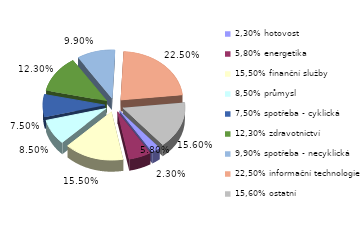
| Category | Series 0 |
|---|---|
| 2,30% hotovost | 0.023 |
| 5,80% energetika | 0.058 |
| 15,50% finanční služby | 0.155 |
| 8,50% průmysl | 0.085 |
| 7,50% spotřeba - cyklická | 0.075 |
| 12,30% zdravotnictví | 0.123 |
| 9,90% spotřeba - necyklická | 0.099 |
| 22,50% informační technologie | 0.225 |
| 15,60% ostatní | 0.156 |